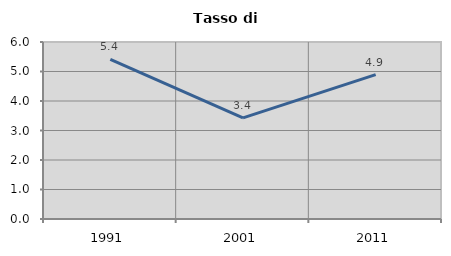
| Category | Tasso di disoccupazione   |
|---|---|
| 1991.0 | 5.414 |
| 2001.0 | 3.426 |
| 2011.0 | 4.895 |